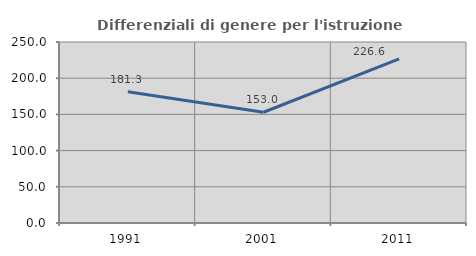
| Category | Differenziali di genere per l'istruzione superiore |
|---|---|
| 1991.0 | 181.261 |
| 2001.0 | 152.972 |
| 2011.0 | 226.601 |